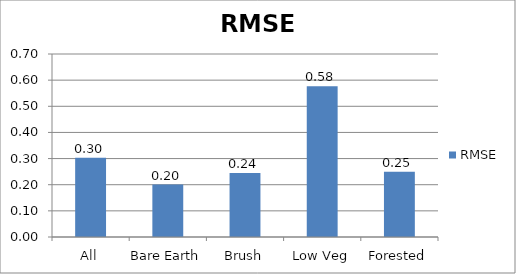
| Category | RMSE |
|---|---|
| All | 0.304 |
| Bare Earth | 0.2 |
| Brush | 0.245 |
| Low Veg | 0.576 |
| Forested | 0.249 |